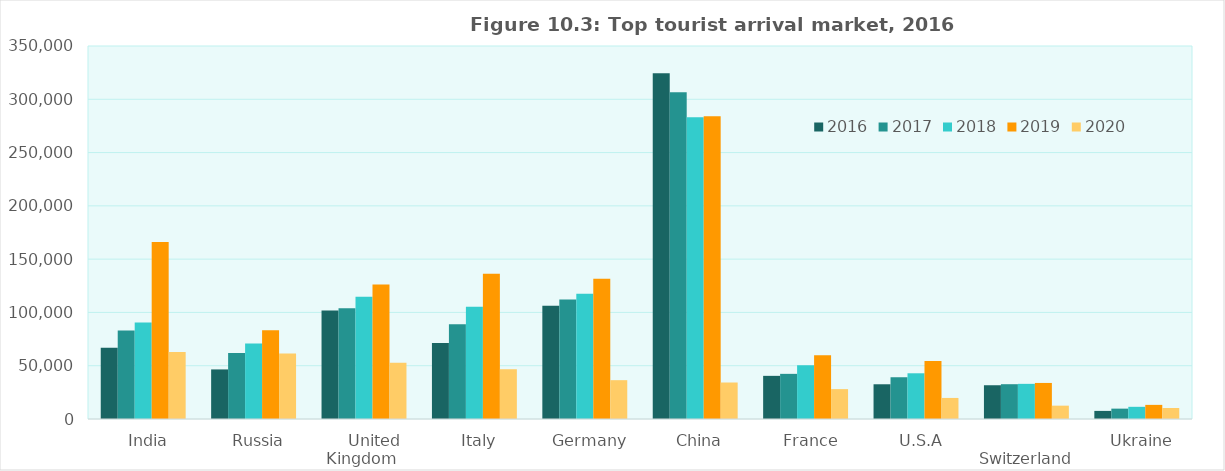
| Category | 2016 | 2017 | 2018 | 2019 | 2020 |
|---|---|---|---|---|---|
|    India | 66955 | 83019 | 90474 | 166030 | 62960 |
|    Russia | 46522 | 61931 | 70935 | 83369 | 61387 |
|    United Kingdom | 101843 | 103977 | 114602 | 126199 | 52720 |
|    Italy | 71202 | 88848 | 105297 | 136343 | 46690 |
|    Germany | 106381 | 112109 | 117532 | 131561 | 36435 |
|    China | 324326 | 306530 | 283116 | 284029 | 34245 |
|    France | 40487 | 42365 | 50476 | 59738 | 28031 |
|    U.S.A | 32589 | 39180 | 42901 | 54474 | 19759 |
|    Switzerland | 31678 | 32651 | 32984 | 33829 | 12517 |
|    Ukraine | 7599 | 9722 | 11430 | 13253 | 10343 |